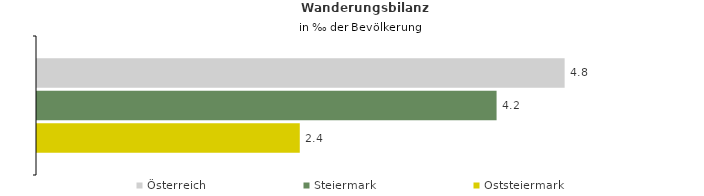
| Category | Österreich | Steiermark | Oststeiermark |
|---|---|---|---|
| Wanderungsrate in ‰ der Bevölkerung, Periode 2017-2021 | 4.789 | 4.172 | 2.385 |